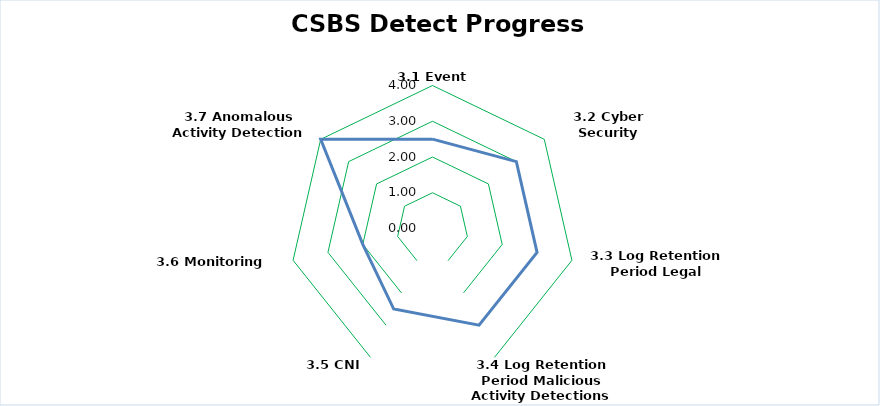
| Category | Detect Progress |
|---|---|
| 3.1 Event Capture | 2.5 |
| 3.2 Cyber Security Incidents | 3 |
| 3.3 Log Retention Period Legal | 3 |
| 3.4 Log Retention Period Malicious Activity Detections | 3 |
| 3.5 CNI Protection | 2.5 |
| 3.6 Monitoring Controls | 2 |
| 3.7 Anomalous Activity Detection | 4 |